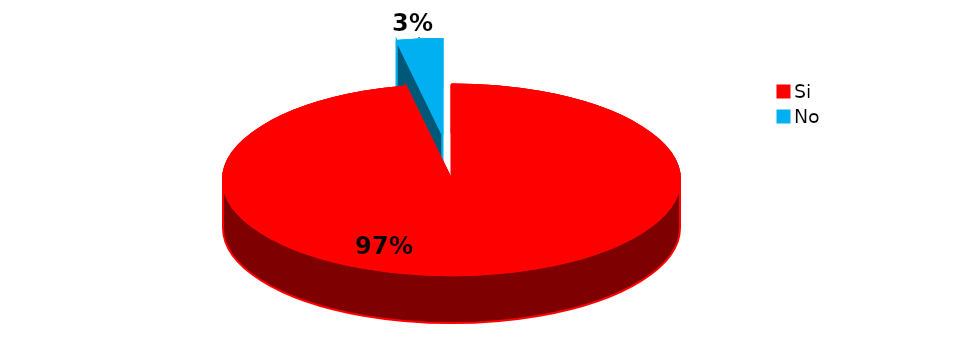
| Category | Series 0 |
|---|---|
| Si | 121 |
| No | 4 |